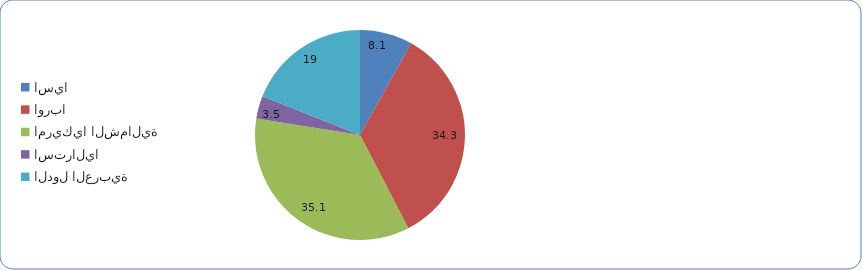
| Category | Series 0 |
|---|---|
| اسيا  | 8.1 |
| اوربا  | 34.3 |
| امريكيا الشمالية  | 35.1 |
| استراليا  | 3.5 |
| الدول العربية  | 19 |